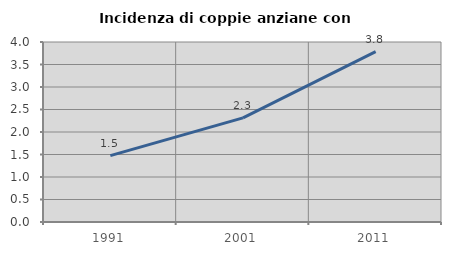
| Category | Incidenza di coppie anziane con figli |
|---|---|
| 1991.0 | 1.475 |
| 2001.0 | 2.314 |
| 2011.0 | 3.784 |